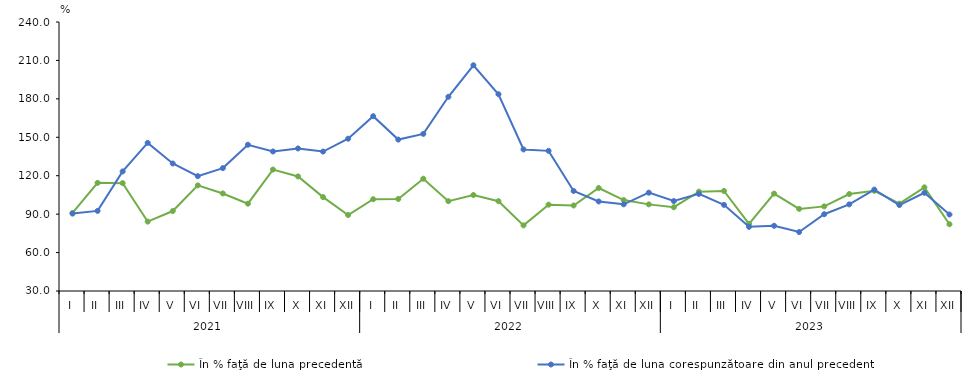
| Category | În % faţă de luna precedentă | În % faţă de luna corespunzătoare din anul precedent |
|---|---|---|
| 0 | 90.925 | 90.416 |
| 1 | 114.411 | 92.545 |
| 2 | 114.206 | 123.335 |
| 3 | 84.167 | 145.626 |
| 4 | 92.422 | 129.533 |
| 5 | 112.451 | 119.639 |
| 6 | 106.133 | 125.946 |
| 7 | 98.164 | 144.165 |
| 8 | 124.797 | 138.933 |
| 9 | 119.448 | 141.264 |
| 10 | 103.298 | 138.861 |
| 11 | 89.311 | 148.904 |
| 12 | 101.655 | 166.474 |
| 13 | 101.849 | 148.199 |
| 14 | 117.644 | 152.66 |
| 15 | 100.129 | 181.611 |
| 16 | 104.952 | 206.233 |
| 17 | 100.113 | 183.604 |
| 18 | 81.219 | 140.505 |
| 19 | 97.396 | 139.406 |
| 20 | 96.775 | 108.103 |
| 21 | 110.394 | 99.91 |
| 22 | 100.99 | 97.677 |
| 23 | 97.627 | 106.772 |
| 24 | 95.423 | 100.224 |
| 25 | 107.534 | 105.819 |
| 26 | 108.106 | 97.24 |
| 27 | 82.458 | 80.079 |
| 28 | 106.032 | 80.903 |
| 29 | 94.094 | 76.039 |
| 30 | 96.063 | 89.936 |
| 31 | 105.71 | 97.613 |
| 32 | 108.246 | 109.183 |
| 33 | 98.196 | 97.119 |
| 34 | 110.919 | 106.667 |
| 35 | 82.115 | 89.719 |